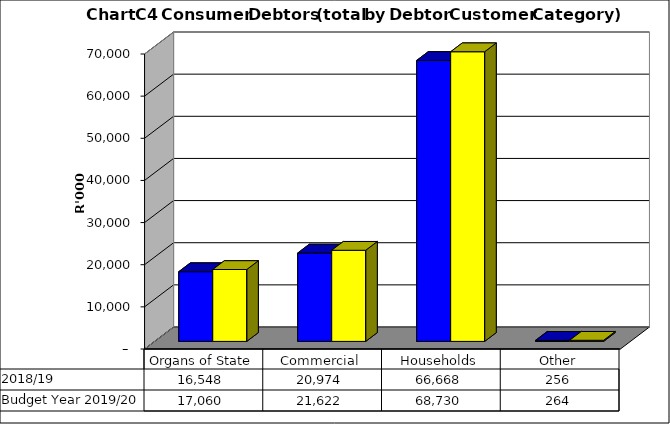
| Category |  2018/19  | Budget Year 2019/20 |
|---|---|---|
| Organs of State | 16547848.074 | 17059637.19 |
| Commercial | 20973818.452 | 21622493.25 |
| Households | 66668169.21 | 68730071.35 |
| Other | 255906.748 | 263821.39 |